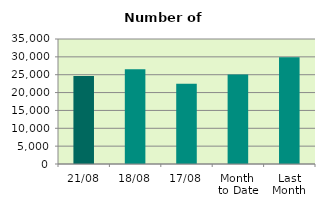
| Category | Series 0 |
|---|---|
| 21/08 | 24610 |
| 18/08 | 26524 |
| 17/08 | 22446 |
| Month 
to Date | 25055.733 |
| Last
Month | 29864.476 |